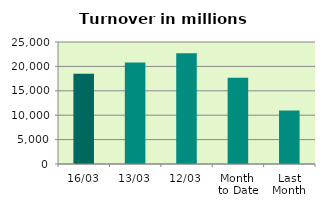
| Category | Series 0 |
|---|---|
| 16/03 | 18475.333 |
| 13/03 | 20787.988 |
| 12/03 | 22676.628 |
| Month 
to Date | 17680.206 |
| Last
Month | 10948.033 |